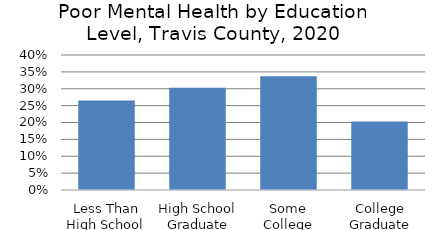
| Category | Series 0 |
|---|---|
| Less Than High School | 0.265 |
| High School Graduate | 0.303 |
| Some College | 0.337 |
| College Graduate | 0.203 |